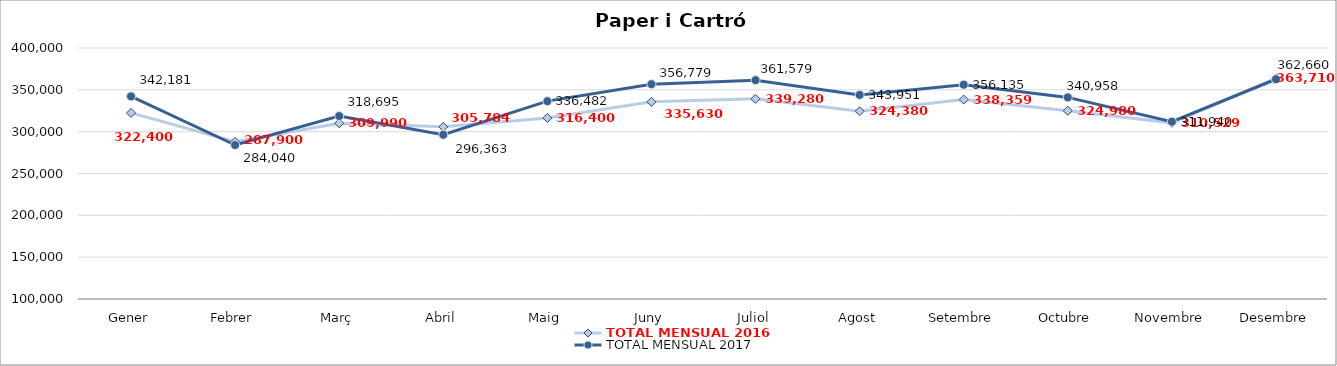
| Category | TOTAL MENSUAL 2016 | TOTAL MENSUAL 2017 |
|---|---|---|
| Gener | 322400.04 | 342181.04 |
| Febrer | 287900.02 | 284040.02 |
| Març | 309989.58 | 318694.52 |
| Abril | 305784 | 296363.26 |
| Maig | 316399.98 | 336482 |
| Juny | 335629.99 | 356779.34 |
| Juliol | 339280 | 361579.29 |
| Agost | 324380 | 343950.86 |
| Setembre | 338359.11 | 356134.88 |
| Octubre | 324979.98 | 340958.15 |
| Novembre | 310529.02 | 311939.99 |
| Desembre | 363709.97 | 362659.98 |